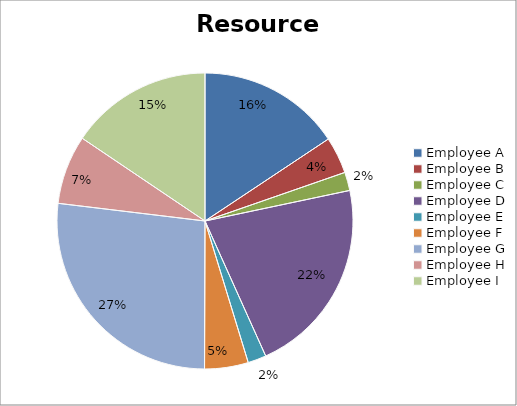
| Category | data |
|---|---|
| Employee A | 4680 |
| Employee B | 1200 |
| Employee C | 600 |
| Employee D | 6450 |
| Employee E | 600 |
| Employee F | 1425 |
| Employee G | 8025 |
| Employee H | 2250 |
| Employee I | 4650 |